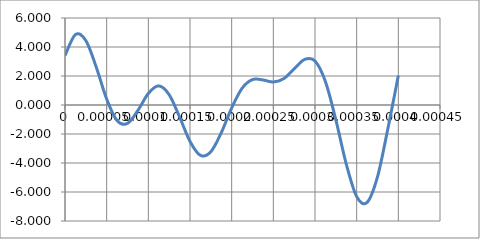
| Category | Vs |
|---|---|
| 0.0 | 3.414 |
| 1.25e-05 | 4.853 |
| 2.5e-05 | 4.444 |
| 3.7500000000000003e-05 | 2.615 |
| 5e-05 | 0.41 |
| 6.25e-05 | -1.076 |
| 7.500000000000001e-05 | -1.268 |
| 8.75e-05 | -0.373 |
| 0.0001 | 0.796 |
| 0.00011250000000000001 | 1.319 |
| 0.000125 | 0.707 |
| 0.0001375 | -0.827 |
| 0.00015000000000000001 | -2.512 |
| 0.00016250000000000002 | -3.473 |
| 0.000175 | -3.223 |
| 0.0001875 | -1.913 |
| 0.0002 | -0.204 |
| 0.00021250000000000002 | 1.154 |
| 0.00022500000000000002 | 1.754 |
| 0.0002375 | 1.727 |
| 0.00025 | 1.586 |
| 0.00026250000000000004 | 1.817 |
| 0.000275 | 2.489 |
| 0.0002875 | 3.142 |
| 0.00030000000000000003 | 3.032 |
| 0.0003125 | 1.617 |
| 0.00032500000000000004 | -1.02 |
| 0.0003375 | -4.071 |
| 0.00035 | -6.316 |
| 0.00036250000000000003 | -6.716 |
| 0.000375 | -4.95 |
| 0.00038750000000000004 | -1.615 |
| 0.0004 | 2.032 |